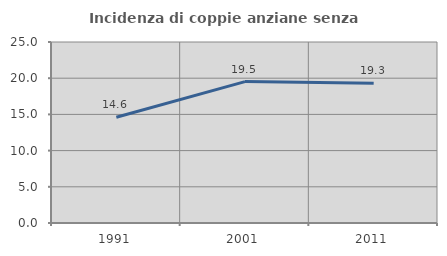
| Category | Incidenza di coppie anziane senza figli  |
|---|---|
| 1991.0 | 14.6 |
| 2001.0 | 19.53 |
| 2011.0 | 19.297 |